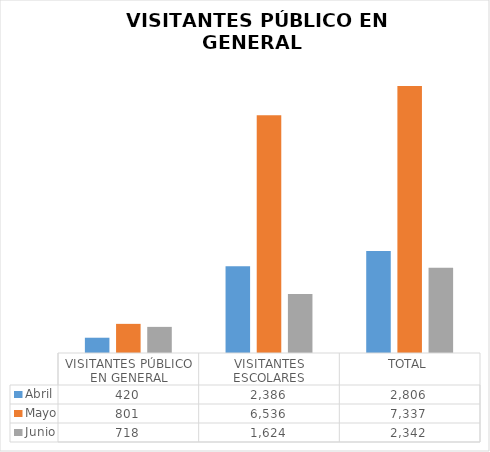
| Category | Abril | Mayo | Junio |
|---|---|---|---|
| VISITANTES PÚBLICO EN GENERAL | 420 | 801 | 718 |
| VISITANTES ESCOLARES | 2386 | 6536 | 1624 |
| TOTAL | 2806 | 7337 | 2342 |